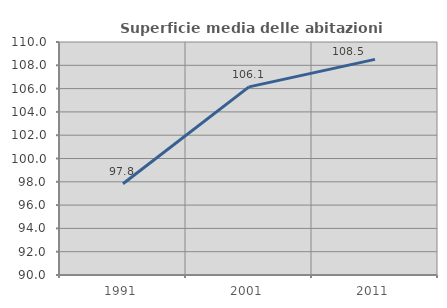
| Category | Superficie media delle abitazioni occupate |
|---|---|
| 1991.0 | 97.832 |
| 2001.0 | 106.147 |
| 2011.0 | 108.506 |